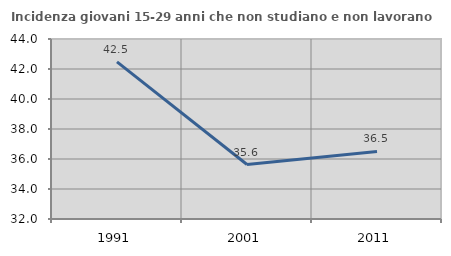
| Category | Incidenza giovani 15-29 anni che non studiano e non lavorano  |
|---|---|
| 1991.0 | 42.478 |
| 2001.0 | 35.632 |
| 2011.0 | 36.503 |